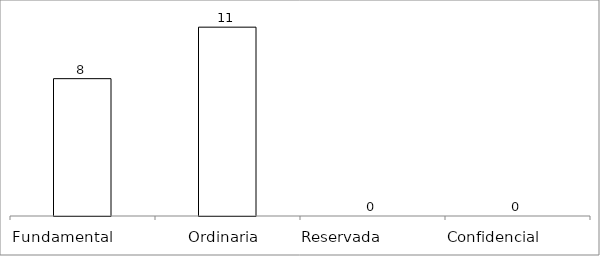
| Category | Series 0 |
|---|---|
| Fundamental         | 8 |
| Ordinaria  | 11 |
| Reservada               | 0 |
| Confidencial             | 0 |